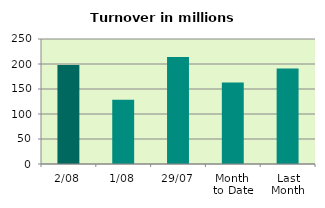
| Category | Series 0 |
|---|---|
| 2/08 | 198.087 |
| 1/08 | 128.341 |
| 29/07 | 213.869 |
| Month 
to Date | 163.214 |
| Last
Month | 191.038 |